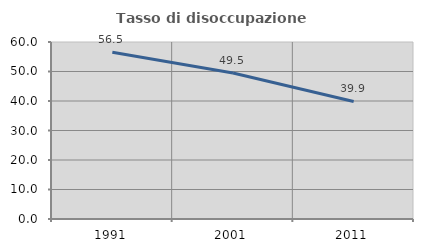
| Category | Tasso di disoccupazione giovanile  |
|---|---|
| 1991.0 | 56.512 |
| 2001.0 | 49.495 |
| 2011.0 | 39.858 |